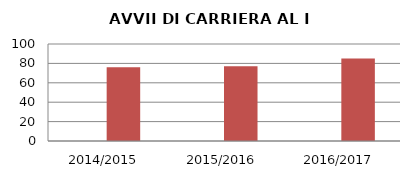
| Category | ANNO | NUMERO |
|---|---|---|
| 2014/2015 | 0 | 76 |
| 2015/2016 | 0 | 77 |
| 2016/2017 | 0 | 85 |